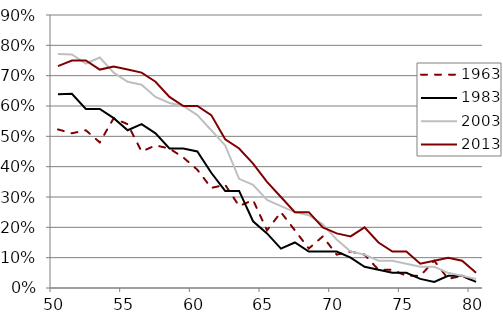
| Category | 1963 | 1983 | 2003 | 2013 |
|---|---|---|---|---|
| 50.0 | 0.523 | 0.639 | 0.772 | 0.732 |
| 51.0 | 0.51 | 0.64 | 0.77 | 0.75 |
| 52.0 | 0.52 | 0.59 | 0.74 | 0.75 |
| 53.0 | 0.48 | 0.59 | 0.76 | 0.72 |
| 54.0 | 0.56 | 0.56 | 0.71 | 0.73 |
| 55.0 | 0.54 | 0.52 | 0.68 | 0.72 |
| 56.0 | 0.45 | 0.54 | 0.67 | 0.71 |
| 57.0 | 0.47 | 0.51 | 0.63 | 0.68 |
| 58.0 | 0.46 | 0.46 | 0.61 | 0.63 |
| 59.0 | 0.43 | 0.46 | 0.6 | 0.6 |
| 60.0 | 0.39 | 0.45 | 0.57 | 0.6 |
| 61.0 | 0.33 | 0.38 | 0.52 | 0.57 |
| 62.0 | 0.34 | 0.32 | 0.47 | 0.49 |
| 63.0 | 0.27 | 0.32 | 0.36 | 0.46 |
| 64.0 | 0.29 | 0.22 | 0.34 | 0.41 |
| 65.0 | 0.19 | 0.18 | 0.29 | 0.35 |
| 66.0 | 0.25 | 0.13 | 0.27 | 0.3 |
| 67.0 | 0.19 | 0.15 | 0.25 | 0.25 |
| 68.0 | 0.13 | 0.12 | 0.24 | 0.25 |
| 69.0 | 0.17 | 0.12 | 0.21 | 0.2 |
| 70.0 | 0.11 | 0.12 | 0.16 | 0.18 |
| 71.0 | 0.12 | 0.1 | 0.12 | 0.17 |
| 72.0 | 0.11 | 0.07 | 0.11 | 0.2 |
| 73.0 | 0.06 | 0.06 | 0.09 | 0.15 |
| 74.0 | 0.06 | 0.05 | 0.09 | 0.12 |
| 75.0 | 0.04 | 0.05 | 0.08 | 0.12 |
| 76.0 | 0.04 | 0.03 | 0.07 | 0.08 |
| 77.0 | 0.09 | 0.02 | 0.07 | 0.09 |
| 78.0 | 0.03 | 0.04 | 0.05 | 0.1 |
| 79.0 | 0.04 | 0.04 | 0.04 | 0.09 |
| 80.0 | 0.02 | 0.02 | 0.03 | 0.05 |